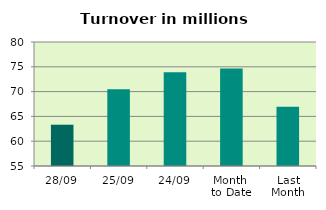
| Category | Series 0 |
|---|---|
| 28/09 | 63.324 |
| 25/09 | 70.458 |
| 24/09 | 73.903 |
| Month 
to Date | 74.68 |
| Last
Month | 66.948 |